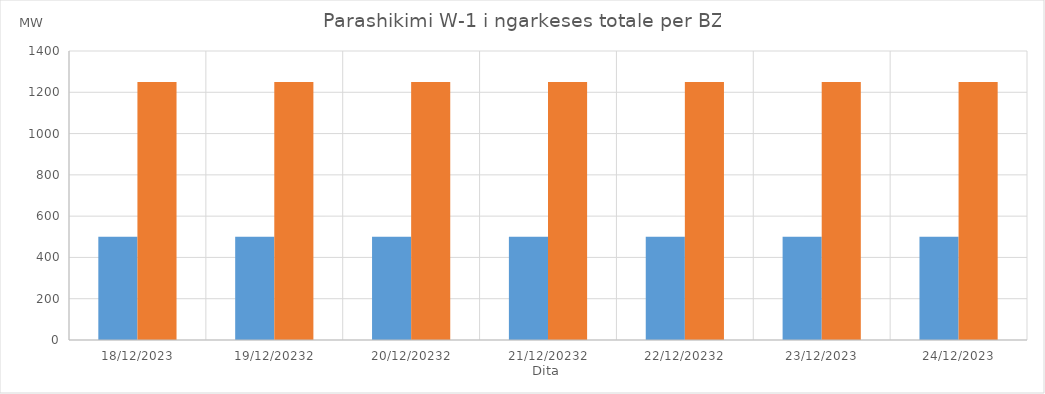
| Category | Min (MW) | Max (MW) |
|---|---|---|
| 18/12/2023 | 500 | 1250 |
| 19/12/20232 | 500 | 1250 |
| 20/12/20232 | 500 | 1250 |
| 21/12/20232 | 500 | 1250 |
| 22/12/20232 | 500 | 1250 |
| 23/12/2023 | 500 | 1250 |
| 24/12/2023 | 500 | 1250 |